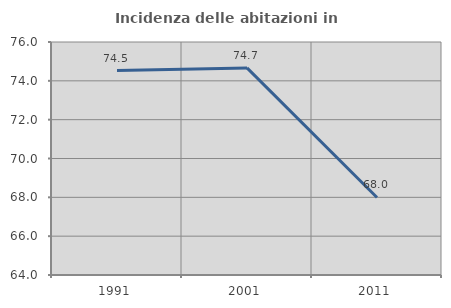
| Category | Incidenza delle abitazioni in proprietà  |
|---|---|
| 1991.0 | 74.529 |
| 2001.0 | 74.667 |
| 2011.0 | 67.993 |